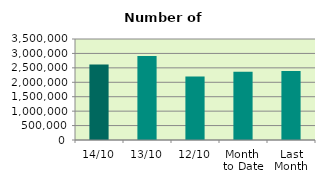
| Category | Series 0 |
|---|---|
| 14/10 | 2614614 |
| 13/10 | 2915108 |
| 12/10 | 2197630 |
| Month 
to Date | 2363939.4 |
| Last
Month | 2392468.182 |